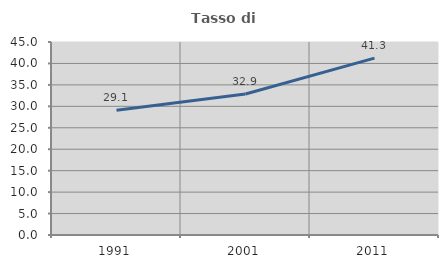
| Category | Tasso di occupazione   |
|---|---|
| 1991.0 | 29.104 |
| 2001.0 | 32.879 |
| 2011.0 | 41.25 |